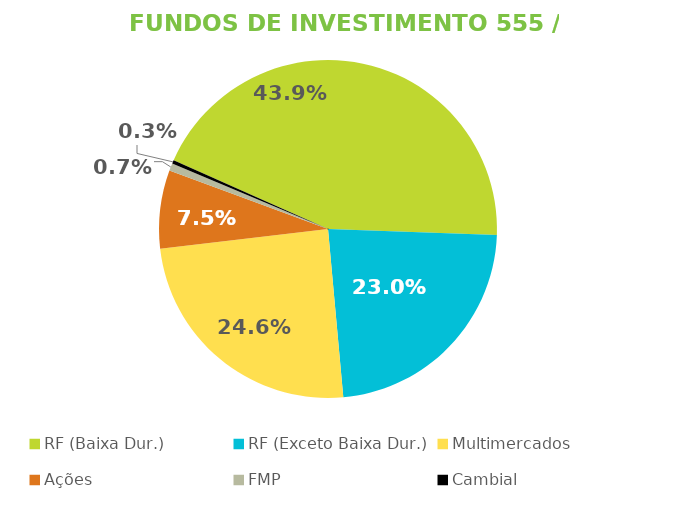
| Category | Fundos de Investimento 555 / FMP |
|---|---|
| RF (Baixa Dur.) | 0.439 |
| RF (Exceto Baixa Dur.) | 0.23 |
| Multimercados | 0.246 |
| Ações | 0.075 |
| FMP | 0.007 |
| Cambial | 0.003 |